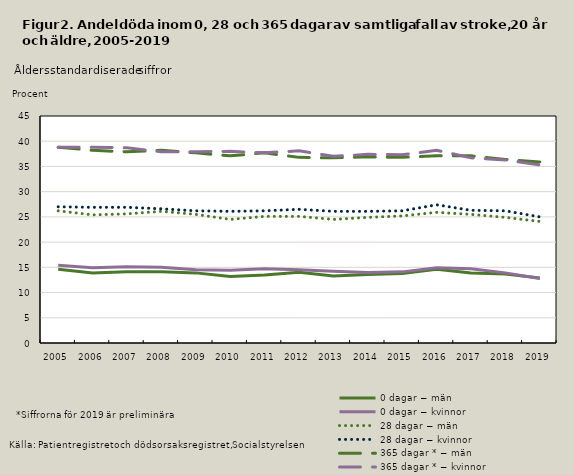
| Category | 0 dagar − män | 0 dagar − kvinnor | 28 dagar − män | 28 dagar − kvinnor | 365 dagar * − män | 365 dagar * − kvinnor |
|---|---|---|---|---|---|---|
| 2005.0 | 14.6 | 15.4 | 26.2 | 27 | 38.8 | 38.8 |
| 2006.0 | 13.9 | 14.9 | 25.4 | 26.9 | 38.2 | 38.8 |
| 2007.0 | 14.1 | 15.1 | 25.6 | 26.9 | 37.9 | 38.7 |
| 2008.0 | 14.1 | 15 | 26.1 | 26.6 | 38.2 | 37.9 |
| 2009.0 | 13.9 | 14.5 | 25.5 | 26.2 | 37.7 | 37.9 |
| 2010.0 | 13.2 | 14.4 | 24.5 | 26.1 | 37.1 | 38 |
| 2011.0 | 13.5 | 14.7 | 25.1 | 26.2 | 37.7 | 37.7 |
| 2012.0 | 14 | 14.5 | 25.1 | 26.5 | 36.8 | 38.1 |
| 2013.0 | 13.3 | 14.2 | 24.5 | 26.1 | 36.7 | 37 |
| 2014.0 | 13.6 | 14 | 24.9 | 26.1 | 36.9 | 37.4 |
| 2015.0 | 13.8 | 14.1 | 25.2 | 26.2 | 36.8 | 37.3 |
| 2016.0 | 14.6 | 14.9 | 25.9 | 27.4 | 37.1 | 38.2 |
| 2017.0 | 13.9 | 14.7 | 25.5 | 26.3 | 37.1 | 36.7 |
| 2018.0 | 13.7 | 13.9 | 24.9 | 26.2 | 36.4 | 36.3 |
| 2019.0 | 12.9 | 12.8 | 24.1 | 25 | 35.9 | 35.3 |